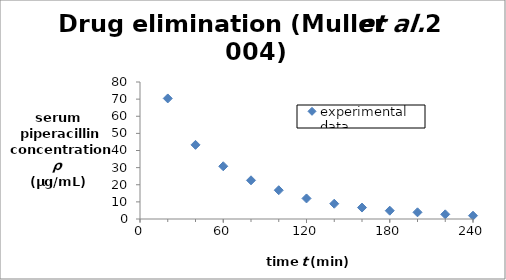
| Category | experimental data |
|---|---|
| 20.0 | 70.4 |
| 40.0 | 43.3 |
| 60.0 | 30.8 |
| 80.0 | 22.6 |
| 100.0 | 16.8 |
| 120.0 | 12 |
| 140.0 | 8.92 |
| 160.0 | 6.68 |
| 180.0 | 4.85 |
| 200.0 | 3.91 |
| 220.0 | 2.72 |
| 240.0 | 1.92 |